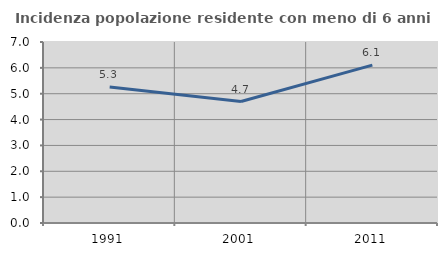
| Category | Incidenza popolazione residente con meno di 6 anni |
|---|---|
| 1991.0 | 5.259 |
| 2001.0 | 4.697 |
| 2011.0 | 6.106 |